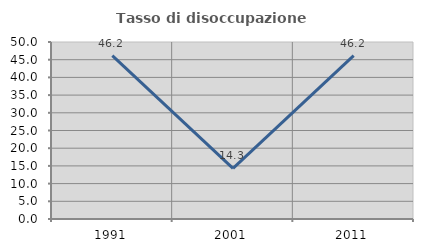
| Category | Tasso di disoccupazione giovanile  |
|---|---|
| 1991.0 | 46.154 |
| 2001.0 | 14.286 |
| 2011.0 | 46.154 |